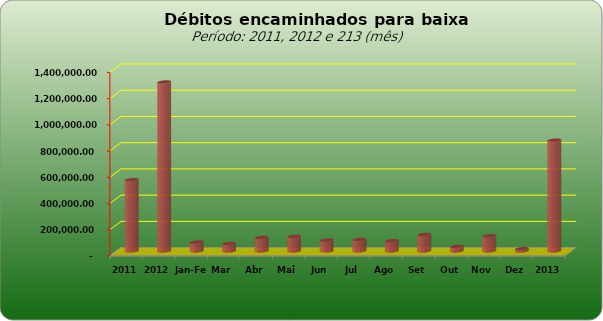
| Category |  543.796,20   1.288.982,12   68.983,48   57.649,63   103.629,52   112.546,24   82.743,05   88.789,93   78.810,72   125.756,48   34.869,40   116.804,43   17.651,93   845.382,43  |
|---|---|
| 2011 | 543796.2 |
| 2012 | 1288982.12 |
| Jan-Fev | 68983.48 |
| Mar | 57649.63 |
| Abr | 103629.52 |
| Mai | 112546.24 |
| Jun | 82743.05 |
| Jul | 88789.93 |
| Ago | 78810.72 |
| Set | 125756.48 |
| Out | 34869.4 |
| Nov | 116804.43 |
| Dez | 17651.93 |
| 2013 | 845382.43 |